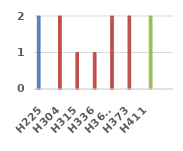
| Category | Series 0 | Series 1 | Series 2 |
|---|---|---|---|
| H225 | 2 | 0 | 0 |
| H304 | 0 | 2 | 0 |
| H315 | 0 | 1 | 0 |
| H336 | 0 | 1 | 0 |
| H361f | 0 | 2 | 0 |
| H373 | 0 | 2 | 0 |
| H411 | 0 | 0 | 2 |